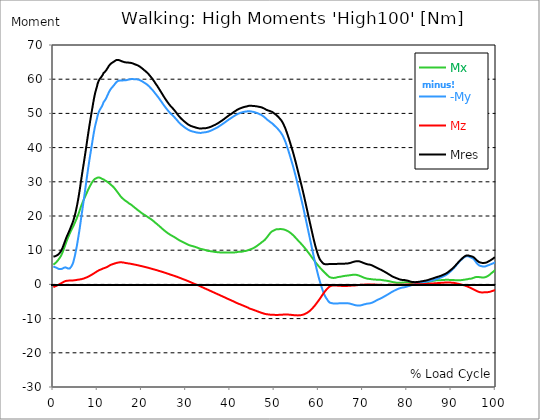
| Category |  Mx |  -My |  Mz |  Mres |
|---|---|---|---|---|
| 0.0 | 5.782 | 5.266 | -0.828 | 8.141 |
| 0.1646090534979424 | 5.938 | 5.157 | -0.719 | 8.172 |
| 0.3292181069958848 | 6.094 | 5.047 | -0.609 | 8.204 |
| 0.5041152263374485 | 6.282 | 4.985 | -0.516 | 8.282 |
| 0.668724279835391 | 6.5 | 4.891 | -0.422 | 8.391 |
| 0.8333333333333333 | 6.735 | 4.766 | -0.313 | 8.501 |
| 0.9979423868312757 | 6.985 | 4.657 | -0.203 | 8.641 |
| 1.162551440329218 | 7.282 | 4.547 | -0.094 | 8.813 |
| 1.337448559670782 | 7.579 | 4.485 | 0.016 | 9.032 |
| 1.5020576131687242 | 7.875 | 4.453 | 0.125 | 9.266 |
| 1.6666666666666665 | 8.251 | 4.469 | 0.266 | 9.61 |
| 1.831275720164609 | 8.672 | 4.547 | 0.391 | 10.016 |
| 1.9958847736625513 | 9.126 | 4.578 | 0.5 | 10.454 |
| 2.170781893004115 | 9.672 | 4.703 | 0.641 | 11.001 |
| 2.3353909465020575 | 10.235 | 4.828 | 0.75 | 11.579 |
| 2.4999999999999996 | 10.829 | 4.938 | 0.859 | 12.173 |
| 2.6646090534979425 | 11.438 | 4.985 | 0.953 | 12.766 |
| 2.829218106995885 | 12.048 | 4.969 | 1.016 | 13.345 |
| 3.0041152263374484 | 12.657 | 4.86 | 1.047 | 13.891 |
| 3.168724279835391 | 13.22 | 4.735 | 1.063 | 14.376 |
| 3.333333333333333 | 13.735 | 4.641 | 1.094 | 14.845 |
| 3.497942386831276 | 14.251 | 4.578 | 1.109 | 15.329 |
| 3.662551440329218 | 14.767 | 4.625 | 1.125 | 15.829 |
| 3.837448559670782 | 15.251 | 4.828 | 1.141 | 16.376 |
| 4.002057613168724 | 15.704 | 5.11 | 1.141 | 16.923 |
| 4.166666666666667 | 16.142 | 5.453 | 1.156 | 17.454 |
| 4.3312757201646095 | 16.564 | 5.875 | 1.156 | 18.001 |
| 4.495884773662552 | 16.985 | 6.438 | 1.156 | 18.595 |
| 4.670781893004115 | 17.47 | 7.313 | 1.188 | 19.345 |
| 4.835390946502058 | 17.939 | 8.188 | 1.219 | 20.079 |
| 4.999999999999999 | 18.439 | 9.219 | 1.25 | 20.97 |
| 5.164609053497943 | 18.954 | 10.298 | 1.281 | 21.939 |
| 5.329218106995885 | 19.454 | 11.423 | 1.328 | 22.955 |
| 5.504115226337448 | 20.001 | 12.688 | 1.359 | 24.095 |
| 5.668724279835391 | 20.548 | 13.985 | 1.391 | 25.298 |
| 5.833333333333333 | 21.173 | 15.36 | 1.422 | 26.611 |
| 5.997942386831276 | 21.798 | 16.767 | 1.453 | 27.986 |
| 6.162551440329218 | 22.47 | 18.329 | 1.484 | 29.517 |
| 6.337448559670782 | 23.064 | 19.845 | 1.531 | 30.939 |
| 6.502057613168724 | 23.626 | 21.345 | 1.578 | 32.346 |
| 6.666666666666666 | 24.158 | 22.845 | 1.641 | 33.752 |
| 6.831275720164609 | 24.673 | 24.345 | 1.719 | 35.112 |
| 6.995884773662552 | 25.158 | 25.83 | 1.781 | 36.487 |
| 7.170781893004115 | 25.642 | 27.424 | 1.875 | 37.893 |
| 7.3353909465020575 | 26.111 | 29.017 | 1.953 | 39.315 |
| 7.500000000000001 | 26.611 | 30.564 | 2.047 | 40.799 |
| 7.664609053497942 | 27.111 | 32.111 | 2.125 | 42.284 |
| 7.829218106995885 | 27.595 | 33.596 | 2.219 | 43.737 |
| 8.004115226337449 | 28.033 | 35.08 | 2.328 | 45.159 |
| 8.168724279835391 | 28.47 | 36.518 | 2.438 | 46.55 |
| 8.333333333333334 | 28.877 | 37.862 | 2.578 | 47.862 |
| 8.497942386831278 | 29.283 | 39.206 | 2.703 | 49.159 |
| 8.662551440329219 | 29.658 | 40.549 | 2.828 | 50.472 |
| 8.837448559670783 | 30.002 | 41.878 | 2.953 | 51.738 |
| 9.002057613168725 | 30.299 | 43.221 | 3.078 | 53.003 |
| 9.166666666666668 | 30.58 | 44.503 | 3.219 | 54.206 |
| 9.33127572016461 | 30.783 | 45.643 | 3.36 | 55.285 |
| 9.495884773662551 | 30.955 | 46.675 | 3.516 | 56.238 |
| 9.670781893004117 | 31.033 | 47.55 | 3.641 | 57.019 |
| 9.83539094650206 | 31.096 | 48.362 | 3.781 | 57.754 |
| 9.999999999999998 | 31.221 | 49.347 | 3.906 | 58.644 |
| 10.16460905349794 | 31.268 | 50.034 | 4.031 | 59.269 |
| 10.329218106995887 | 31.268 | 50.581 | 4.141 | 59.738 |
| 10.504115226337447 | 31.221 | 51.066 | 4.235 | 60.129 |
| 10.66872427983539 | 31.111 | 51.409 | 4.328 | 60.394 |
| 10.833333333333334 | 30.986 | 51.738 | 4.407 | 60.629 |
| 10.997942386831275 | 30.861 | 52.128 | 4.5 | 60.91 |
| 11.162551440329217 | 30.768 | 52.628 | 4.594 | 61.301 |
| 11.337448559670783 | 30.705 | 53.222 | 4.703 | 61.785 |
| 11.502057613168724 | 30.549 | 53.535 | 4.782 | 62.004 |
| 11.666666666666666 | 30.392 | 53.816 | 4.844 | 62.16 |
| 11.831275720164609 | 30.283 | 54.16 | 4.922 | 62.41 |
| 11.995884773662551 | 30.158 | 54.597 | 5.016 | 62.723 |
| 12.170781893004115 | 30.017 | 55.097 | 5.141 | 63.098 |
| 12.335390946502057 | 29.861 | 55.519 | 5.235 | 63.394 |
| 12.5 | 29.721 | 56.035 | 5.375 | 63.785 |
| 12.664609053497943 | 29.533 | 56.457 | 5.5 | 64.066 |
| 12.829218106995885 | 29.361 | 56.847 | 5.625 | 64.348 |
| 13.004115226337449 | 29.142 | 57.175 | 5.719 | 64.551 |
| 13.168724279835391 | 28.971 | 57.441 | 5.813 | 64.707 |
| 13.333333333333332 | 28.783 | 57.691 | 5.891 | 64.848 |
| 13.497942386831276 | 28.58 | 57.925 | 5.953 | 64.988 |
| 13.662551440329217 | 28.361 | 58.175 | 6.032 | 65.113 |
| 13.837448559670783 | 28.111 | 58.457 | 6.094 | 65.27 |
| 14.002057613168724 | 27.83 | 58.769 | 6.172 | 65.426 |
| 14.166666666666666 | 27.564 | 59.05 | 6.235 | 65.567 |
| 14.33127572016461 | 27.267 | 59.238 | 6.297 | 65.629 |
| 14.495884773662551 | 26.986 | 59.394 | 6.36 | 65.645 |
| 14.670781893004115 | 26.689 | 59.519 | 6.391 | 65.645 |
| 14.835390946502057 | 26.408 | 59.566 | 6.422 | 65.582 |
| 15.000000000000002 | 26.111 | 59.597 | 6.454 | 65.488 |
| 15.164609053497943 | 25.798 | 59.629 | 6.469 | 65.41 |
| 15.329218106995883 | 25.548 | 59.629 | 6.469 | 65.301 |
| 15.504115226337449 | 25.314 | 59.644 | 6.454 | 65.223 |
| 15.66872427983539 | 25.111 | 59.644 | 6.422 | 65.145 |
| 15.833333333333334 | 24.939 | 59.66 | 6.391 | 65.082 |
| 15.997942386831276 | 24.752 | 59.676 | 6.36 | 65.035 |
| 16.162551440329217 | 24.58 | 59.676 | 6.313 | 64.957 |
| 16.337448559670783 | 24.439 | 59.691 | 6.266 | 64.926 |
| 16.502057613168724 | 24.283 | 59.722 | 6.235 | 64.895 |
| 16.666666666666668 | 24.126 | 59.769 | 6.188 | 64.879 |
| 16.83127572016461 | 23.97 | 59.832 | 6.157 | 64.863 |
| 16.995884773662556 | 23.798 | 59.894 | 6.125 | 64.848 |
| 17.170781893004115 | 23.626 | 59.941 | 6.094 | 64.832 |
| 17.33539094650206 | 23.501 | 59.972 | 6.063 | 64.801 |
| 17.500000000000004 | 23.376 | 60.004 | 6.016 | 64.77 |
| 17.66460905349794 | 23.22 | 60.035 | 5.985 | 64.738 |
| 17.82921810699589 | 23.048 | 60.051 | 5.938 | 64.676 |
| 18.00411522633745 | 22.876 | 60.035 | 5.891 | 64.598 |
| 18.16872427983539 | 22.689 | 60.019 | 5.844 | 64.504 |
| 18.333333333333336 | 22.517 | 59.988 | 5.797 | 64.41 |
| 18.497942386831276 | 22.329 | 59.972 | 5.75 | 64.316 |
| 18.66255144032922 | 22.158 | 59.972 | 5.719 | 64.238 |
| 18.837448559670786 | 22.001 | 59.957 | 5.672 | 64.176 |
| 19.002057613168724 | 21.829 | 59.941 | 5.625 | 64.098 |
| 19.166666666666668 | 21.642 | 59.894 | 5.578 | 63.973 |
| 19.331275720164612 | 21.486 | 59.832 | 5.532 | 63.848 |
| 19.495884773662553 | 21.329 | 59.754 | 5.485 | 63.723 |
| 19.67078189300412 | 21.158 | 59.66 | 5.422 | 63.566 |
| 19.83539094650206 | 20.986 | 59.551 | 5.375 | 63.41 |
| 19.999999999999996 | 20.829 | 59.426 | 5.328 | 63.238 |
| 20.164609053497944 | 20.689 | 59.3 | 5.266 | 63.066 |
| 20.32921810699588 | 20.533 | 59.175 | 5.219 | 62.894 |
| 20.504115226337447 | 20.407 | 59.019 | 5.157 | 62.691 |
| 20.66872427983539 | 20.267 | 58.879 | 5.11 | 62.519 |
| 20.833333333333332 | 20.142 | 58.738 | 5.063 | 62.348 |
| 20.997942386831276 | 20.001 | 58.613 | 5.016 | 62.176 |
| 21.162551440329217 | 19.861 | 58.441 | 4.953 | 61.957 |
| 21.33744855967078 | 19.72 | 58.269 | 4.891 | 61.738 |
| 21.502057613168724 | 19.564 | 58.082 | 4.844 | 61.519 |
| 21.666666666666668 | 19.423 | 57.879 | 4.782 | 61.269 |
| 21.83127572016461 | 19.282 | 57.644 | 4.719 | 61.004 |
| 21.99588477366255 | 19.142 | 57.41 | 4.657 | 60.738 |
| 22.170781893004115 | 18.986 | 57.191 | 4.594 | 60.472 |
| 22.335390946502056 | 18.829 | 56.957 | 4.532 | 60.191 |
| 22.5 | 18.657 | 56.722 | 4.469 | 59.91 |
| 22.664609053497944 | 18.47 | 56.457 | 4.407 | 59.597 |
| 22.82921810699588 | 18.282 | 56.191 | 4.36 | 59.285 |
| 23.004115226337447 | 18.095 | 55.894 | 4.297 | 58.957 |
| 23.16872427983539 | 17.907 | 55.628 | 4.235 | 58.629 |
| 23.333333333333332 | 17.72 | 55.347 | 4.172 | 58.3 |
| 23.497942386831276 | 17.564 | 55.081 | 4.094 | 58.004 |
| 23.662551440329217 | 17.376 | 54.8 | 4.031 | 57.66 |
| 23.83744855967078 | 17.189 | 54.503 | 3.969 | 57.332 |
| 24.002057613168727 | 17.001 | 54.206 | 3.906 | 56.972 |
| 24.166666666666664 | 16.814 | 53.894 | 3.844 | 56.628 |
| 24.33127572016461 | 16.61 | 53.597 | 3.781 | 56.269 |
| 24.495884773662553 | 16.423 | 53.285 | 3.719 | 55.925 |
| 24.670781893004115 | 16.235 | 52.972 | 3.641 | 55.566 |
| 24.83539094650206 | 16.048 | 52.659 | 3.578 | 55.206 |
| 25.0 | 15.86 | 52.363 | 3.516 | 54.863 |
| 25.164609053497944 | 15.688 | 52.081 | 3.438 | 54.535 |
| 25.329218106995885 | 15.517 | 51.784 | 3.375 | 54.206 |
| 25.504115226337447 | 15.345 | 51.503 | 3.297 | 53.878 |
| 25.66872427983539 | 15.173 | 51.222 | 3.219 | 53.566 |
| 25.833333333333332 | 15.017 | 50.956 | 3.141 | 53.269 |
| 25.997942386831276 | 14.86 | 50.706 | 3.078 | 52.972 |
| 26.16255144032922 | 14.72 | 50.441 | 3 | 52.675 |
| 26.337448559670783 | 14.579 | 50.191 | 2.922 | 52.394 |
| 26.502057613168724 | 14.454 | 49.987 | 2.86 | 52.159 |
| 26.666666666666664 | 14.329 | 49.784 | 2.781 | 51.925 |
| 26.83127572016461 | 14.22 | 49.581 | 2.719 | 51.706 |
| 26.995884773662553 | 14.095 | 49.394 | 2.641 | 51.488 |
| 27.170781893004115 | 13.97 | 49.159 | 2.563 | 51.222 |
| 27.33539094650206 | 13.845 | 48.925 | 2.5 | 50.956 |
| 27.499999999999996 | 13.72 | 48.706 | 2.422 | 50.706 |
| 27.66460905349794 | 13.579 | 48.456 | 2.344 | 50.425 |
| 27.829218106995885 | 13.438 | 48.206 | 2.281 | 50.144 |
| 28.004115226337447 | 13.298 | 47.956 | 2.203 | 49.862 |
| 28.16872427983539 | 13.157 | 47.69 | 2.11 | 49.566 |
| 28.333333333333332 | 13.016 | 47.44 | 2.031 | 49.284 |
| 28.49794238683128 | 12.891 | 47.222 | 1.953 | 49.034 |
| 28.66255144032922 | 12.782 | 47.003 | 1.875 | 48.8 |
| 28.837448559670783 | 12.673 | 46.8 | 1.781 | 48.581 |
| 29.002057613168724 | 12.563 | 46.612 | 1.703 | 48.362 |
| 29.166666666666664 | 12.47 | 46.425 | 1.625 | 48.159 |
| 29.331275720164612 | 12.36 | 46.268 | 1.531 | 47.956 |
| 29.495884773662553 | 12.251 | 46.097 | 1.453 | 47.769 |
| 29.670781893004115 | 12.141 | 45.94 | 1.375 | 47.581 |
| 29.835390946502056 | 12.032 | 45.784 | 1.297 | 47.409 |
| 30.000000000000004 | 11.923 | 45.628 | 1.203 | 47.237 |
| 30.164609053497944 | 11.798 | 45.487 | 1.125 | 47.065 |
| 30.329218106995885 | 11.688 | 45.347 | 1.031 | 46.893 |
| 30.504115226337447 | 11.579 | 45.222 | 0.953 | 46.737 |
| 30.66872427983539 | 11.501 | 45.112 | 0.859 | 46.612 |
| 30.833333333333336 | 11.423 | 45.003 | 0.75 | 46.503 |
| 30.99794238683128 | 11.36 | 44.909 | 0.656 | 46.393 |
| 31.162551440329217 | 11.298 | 44.831 | 0.563 | 46.3 |
| 31.33744855967078 | 11.235 | 44.753 | 0.469 | 46.206 |
| 31.50205761316873 | 11.188 | 44.706 | 0.375 | 46.143 |
| 31.666666666666668 | 11.126 | 44.659 | 0.281 | 46.081 |
| 31.831275720164612 | 11.063 | 44.612 | 0.203 | 46.018 |
| 31.995884773662553 | 11.001 | 44.55 | 0.109 | 45.94 |
| 32.17078189300411 | 10.923 | 44.503 | 0.031 | 45.878 |
| 32.33539094650206 | 10.844 | 44.44 | -0.031 | 45.8 |
| 32.5 | 10.766 | 44.393 | -0.125 | 45.737 |
| 32.66460905349794 | 10.673 | 44.362 | -0.219 | 45.69 |
| 32.82921810699589 | 10.594 | 44.331 | -0.313 | 45.643 |
| 33.00411522633745 | 10.501 | 44.315 | -0.406 | 45.612 |
| 33.168724279835395 | 10.423 | 44.3 | -0.516 | 45.565 |
| 33.333333333333336 | 10.376 | 44.284 | -0.625 | 45.565 |
| 33.49794238683128 | 10.313 | 44.315 | -0.719 | 45.581 |
| 33.66255144032922 | 10.282 | 44.378 | -0.828 | 45.628 |
| 33.83744855967078 | 10.235 | 44.425 | -0.922 | 45.659 |
| 34.00205761316873 | 10.172 | 44.44 | -1.016 | 45.675 |
| 34.16666666666667 | 10.126 | 44.456 | -1.125 | 45.675 |
| 34.331275720164605 | 10.047 | 44.471 | -1.219 | 45.69 |
| 34.49588477366255 | 9.985 | 44.503 | -1.313 | 45.69 |
| 34.67078189300412 | 9.891 | 44.565 | -1.406 | 45.737 |
| 34.83539094650206 | 9.829 | 44.612 | -1.484 | 45.784 |
| 35.00000000000001 | 9.782 | 44.659 | -1.594 | 45.815 |
| 35.16460905349794 | 9.751 | 44.737 | -1.688 | 45.893 |
| 35.32921810699588 | 9.735 | 44.815 | -1.797 | 45.972 |
| 35.504115226337454 | 9.719 | 44.909 | -1.891 | 46.05 |
| 35.668724279835395 | 9.672 | 44.987 | -1.984 | 46.143 |
| 35.833333333333336 | 9.641 | 45.081 | -2.078 | 46.222 |
| 35.99794238683128 | 9.61 | 45.19 | -2.188 | 46.331 |
| 36.16255144032922 | 9.579 | 45.3 | -2.297 | 46.425 |
| 36.33744855967078 | 9.547 | 45.393 | -2.391 | 46.518 |
| 36.50205761316873 | 9.501 | 45.503 | -2.485 | 46.628 |
| 36.66666666666667 | 9.469 | 45.612 | -2.578 | 46.737 |
| 36.831275720164605 | 9.454 | 45.722 | -2.672 | 46.847 |
| 36.99588477366255 | 9.422 | 45.831 | -2.781 | 46.956 |
| 37.17078189300412 | 9.407 | 45.972 | -2.875 | 47.081 |
| 37.33539094650206 | 9.391 | 46.097 | -2.969 | 47.222 |
| 37.5 | 9.376 | 46.237 | -3.078 | 47.362 |
| 37.66460905349794 | 9.344 | 46.378 | -3.172 | 47.503 |
| 37.82921810699589 | 9.329 | 46.534 | -3.266 | 47.659 |
| 38.00411522633745 | 9.313 | 46.675 | -3.36 | 47.8 |
| 38.168724279835395 | 9.329 | 46.815 | -3.469 | 47.94 |
| 38.333333333333336 | 9.329 | 46.956 | -3.563 | 48.097 |
| 38.49794238683127 | 9.329 | 47.112 | -3.656 | 48.253 |
| 38.662551440329224 | 9.329 | 47.269 | -3.75 | 48.409 |
| 38.83744855967078 | 9.329 | 47.425 | -3.86 | 48.581 |
| 39.00205761316872 | 9.329 | 47.581 | -3.953 | 48.753 |
| 39.16666666666667 | 9.344 | 47.737 | -4.047 | 48.909 |
| 39.331275720164605 | 9.344 | 47.894 | -4.157 | 49.081 |
| 39.49588477366255 | 9.344 | 48.05 | -4.266 | 49.237 |
| 39.67078189300412 | 9.344 | 48.206 | -4.36 | 49.409 |
| 39.83539094650206 | 9.344 | 48.347 | -4.469 | 49.55 |
| 39.99999999999999 | 9.313 | 48.472 | -4.547 | 49.675 |
| 40.16460905349794 | 9.297 | 48.612 | -4.641 | 49.8 |
| 40.32921810699589 | 9.297 | 48.753 | -4.735 | 49.956 |
| 40.50411522633745 | 9.313 | 48.909 | -4.828 | 50.112 |
| 40.668724279835395 | 9.313 | 49.065 | -4.922 | 50.284 |
| 40.83333333333333 | 9.329 | 49.206 | -5.032 | 50.441 |
| 40.99794238683128 | 9.36 | 49.331 | -5.125 | 50.566 |
| 41.16255144032922 | 9.376 | 49.456 | -5.235 | 50.706 |
| 41.33744855967078 | 9.407 | 49.581 | -5.344 | 50.847 |
| 41.50205761316872 | 9.438 | 49.722 | -5.453 | 51.003 |
| 41.666666666666664 | 9.469 | 49.831 | -5.547 | 51.144 |
| 41.83127572016461 | 9.516 | 49.925 | -5.625 | 51.238 |
| 41.99588477366255 | 9.547 | 50.003 | -5.719 | 51.331 |
| 42.17078189300412 | 9.532 | 50.097 | -5.797 | 51.441 |
| 42.33539094650206 | 9.532 | 50.191 | -5.875 | 51.519 |
| 42.5 | 9.547 | 50.237 | -5.969 | 51.597 |
| 42.66460905349794 | 9.563 | 50.3 | -6.063 | 51.659 |
| 42.82921810699589 | 9.61 | 50.394 | -6.141 | 51.753 |
| 43.00411522633745 | 9.672 | 50.425 | -6.235 | 51.831 |
| 43.16872427983539 | 9.735 | 50.472 | -6.329 | 51.878 |
| 43.333333333333336 | 9.766 | 50.503 | -6.422 | 51.941 |
| 43.49794238683128 | 9.797 | 50.534 | -6.5 | 51.988 |
| 43.66255144032922 | 9.844 | 50.566 | -6.594 | 52.034 |
| 43.83744855967078 | 9.907 | 50.597 | -6.688 | 52.081 |
| 44.00205761316873 | 9.985 | 50.628 | -6.797 | 52.144 |
| 44.166666666666664 | 10.063 | 50.659 | -6.922 | 52.206 |
| 44.33127572016461 | 10.141 | 50.659 | -7.032 | 52.238 |
| 44.49588477366255 | 10.219 | 50.612 | -7.11 | 52.222 |
| 44.67078189300411 | 10.298 | 50.566 | -7.188 | 52.206 |
| 44.835390946502066 | 10.391 | 50.55 | -7.25 | 52.206 |
| 45.0 | 10.469 | 50.503 | -7.329 | 52.191 |
| 45.16460905349794 | 10.563 | 50.456 | -7.407 | 52.191 |
| 45.32921810699589 | 10.673 | 50.409 | -7.485 | 52.175 |
| 45.504115226337454 | 10.798 | 50.347 | -7.563 | 52.144 |
| 45.668724279835395 | 10.938 | 50.269 | -7.641 | 52.113 |
| 45.83333333333333 | 11.079 | 50.206 | -7.735 | 52.081 |
| 45.99794238683128 | 11.219 | 50.128 | -7.813 | 52.05 |
| 46.16255144032922 | 11.376 | 50.034 | -7.891 | 52.019 |
| 46.33744855967078 | 11.532 | 49.956 | -7.969 | 51.972 |
| 46.50205761316873 | 11.704 | 49.847 | -8.047 | 51.925 |
| 46.666666666666664 | 11.876 | 49.753 | -8.125 | 51.894 |
| 46.831275720164605 | 12.016 | 49.675 | -8.204 | 51.847 |
| 46.99588477366255 | 12.188 | 49.566 | -8.282 | 51.8 |
| 47.17078189300412 | 12.391 | 49.425 | -8.344 | 51.722 |
| 47.33539094650206 | 12.532 | 49.284 | -8.422 | 51.628 |
| 47.5 | 12.673 | 49.144 | -8.485 | 51.534 |
| 47.66460905349794 | 12.86 | 48.972 | -8.563 | 51.425 |
| 47.82921810699588 | 13.063 | 48.784 | -8.626 | 51.316 |
| 48.004115226337454 | 13.298 | 48.597 | -8.672 | 51.191 |
| 48.168724279835395 | 13.563 | 48.378 | -8.704 | 51.05 |
| 48.33333333333333 | 13.845 | 48.175 | -8.735 | 50.941 |
| 48.49794238683128 | 14.126 | 48.019 | -8.766 | 50.878 |
| 48.66255144032922 | 14.423 | 47.862 | -8.797 | 50.816 |
| 48.83744855967078 | 14.704 | 47.69 | -8.829 | 50.737 |
| 49.00205761316873 | 14.954 | 47.519 | -8.844 | 50.659 |
| 49.166666666666664 | 15.204 | 47.362 | -8.86 | 50.581 |
| 49.331275720164605 | 15.407 | 47.222 | -8.876 | 50.519 |
| 49.49588477366255 | 15.563 | 47.05 | -8.891 | 50.409 |
| 49.67078189300412 | 15.673 | 46.862 | -8.907 | 50.269 |
| 49.83539094650206 | 15.751 | 46.659 | -8.907 | 50.097 |
| 50.0 | 15.86 | 46.425 | -8.907 | 49.925 |
| 50.16460905349794 | 15.985 | 46.222 | -8.922 | 49.784 |
| 50.32921810699589 | 16.079 | 46.018 | -8.938 | 49.628 |
| 50.504115226337454 | 16.126 | 45.8 | -8.938 | 49.425 |
| 50.668724279835395 | 16.142 | 45.581 | -8.922 | 49.222 |
| 50.83333333333333 | 16.157 | 45.347 | -8.922 | 49.019 |
| 50.99794238683128 | 16.157 | 45.097 | -8.907 | 48.784 |
| 51.162551440329224 | 16.173 | 44.815 | -8.907 | 48.534 |
| 51.33744855967078 | 16.173 | 44.55 | -8.891 | 48.284 |
| 51.50205761316873 | 16.157 | 44.268 | -8.876 | 48.019 |
| 51.666666666666664 | 16.157 | 43.925 | -8.86 | 47.706 |
| 51.83127572016461 | 16.142 | 43.534 | -8.844 | 47.331 |
| 51.99588477366255 | 16.095 | 43.096 | -8.829 | 46.909 |
| 52.17078189300412 | 16.048 | 42.628 | -8.829 | 46.456 |
| 52.335390946502066 | 15.97 | 42.128 | -8.813 | 45.987 |
| 52.5 | 15.892 | 41.581 | -8.813 | 45.44 |
| 52.66460905349795 | 15.798 | 40.956 | -8.813 | 44.846 |
| 52.82921810699588 | 15.688 | 40.315 | -8.829 | 44.237 |
| 53.00411522633745 | 15.595 | 39.659 | -8.829 | 43.596 |
| 53.1687242798354 | 15.47 | 38.987 | -8.844 | 42.956 |
| 53.33333333333333 | 15.329 | 38.299 | -8.844 | 42.284 |
| 53.49794238683128 | 15.173 | 37.58 | -8.876 | 41.581 |
| 53.66255144032922 | 15.001 | 36.862 | -8.891 | 40.877 |
| 53.83744855967078 | 14.813 | 36.127 | -8.922 | 40.159 |
| 54.00205761316873 | 14.642 | 35.424 | -8.938 | 39.456 |
| 54.166666666666664 | 14.438 | 34.674 | -8.969 | 38.721 |
| 54.33127572016461 | 14.235 | 33.908 | -8.985 | 37.971 |
| 54.495884773662546 | 14.001 | 33.096 | -9.001 | 37.174 |
| 54.67078189300412 | 13.782 | 32.268 | -9.032 | 36.346 |
| 54.835390946502066 | 13.548 | 31.424 | -9.047 | 35.533 |
| 54.99999999999999 | 13.313 | 30.564 | -9.047 | 34.674 |
| 55.16460905349795 | 13.079 | 29.674 | -9.063 | 33.815 |
| 55.32921810699588 | 12.829 | 28.799 | -9.063 | 32.94 |
| 55.50411522633745 | 12.595 | 27.908 | -9.047 | 32.08 |
| 55.668724279835395 | 12.36 | 27.017 | -9.032 | 31.221 |
| 55.83333333333333 | 12.126 | 26.127 | -9.001 | 30.346 |
| 55.99794238683128 | 11.923 | 25.252 | -8.985 | 29.502 |
| 56.162551440329224 | 11.688 | 24.33 | -8.938 | 28.627 |
| 56.33744855967078 | 11.438 | 23.392 | -8.891 | 27.72 |
| 56.50205761316873 | 11.188 | 22.454 | -8.829 | 26.799 |
| 56.666666666666664 | 10.938 | 21.501 | -8.766 | 25.877 |
| 56.83127572016461 | 10.673 | 20.517 | -8.672 | 24.923 |
| 56.99588477366256 | 10.407 | 19.501 | -8.563 | 23.939 |
| 57.17078189300412 | 10.126 | 18.486 | -8.454 | 22.955 |
| 57.335390946502066 | 9.844 | 17.485 | -8.329 | 21.986 |
| 57.49999999999999 | 9.563 | 16.47 | -8.204 | 21.001 |
| 57.66460905349794 | 9.282 | 15.454 | -8.063 | 20.017 |
| 57.829218106995896 | 9.001 | 14.454 | -7.907 | 19.048 |
| 58.00411522633745 | 8.719 | 13.438 | -7.719 | 18.095 |
| 58.168724279835395 | 8.422 | 12.438 | -7.516 | 17.142 |
| 58.33333333333333 | 8.125 | 11.423 | -7.313 | 16.173 |
| 58.49794238683128 | 7.844 | 10.407 | -7.079 | 15.22 |
| 58.662551440329224 | 7.547 | 9.407 | -6.86 | 14.266 |
| 58.83744855967078 | 7.25 | 8.407 | -6.625 | 13.329 |
| 59.00205761316873 | 6.969 | 7.407 | -6.375 | 12.438 |
| 59.16666666666666 | 6.672 | 6.438 | -6.094 | 11.579 |
| 59.33127572016461 | 6.375 | 5.516 | -5.828 | 10.782 |
| 59.49588477366256 | 6.094 | 4.625 | -5.532 | 10.047 |
| 59.67078189300411 | 5.828 | 3.75 | -5.25 | 9.344 |
| 59.835390946502066 | 5.563 | 2.891 | -4.953 | 8.688 |
| 60.00000000000001 | 5.313 | 2.047 | -4.657 | 8.079 |
| 60.16460905349794 | 5.063 | 1.266 | -4.36 | 7.547 |
| 60.32921810699589 | 4.828 | 0.547 | -4.047 | 7.188 |
| 60.50411522633745 | 4.594 | -0.156 | -3.719 | 6.875 |
| 60.66872427983539 | 4.36 | -0.828 | -3.406 | 6.61 |
| 60.833333333333336 | 4.125 | -1.484 | -3.078 | 6.36 |
| 60.99794238683128 | 3.906 | -2.11 | -2.766 | 6.141 |
| 61.162551440329224 | 3.688 | -2.688 | -2.469 | 5.985 |
| 61.33744855967078 | 3.469 | -3.188 | -2.172 | 5.907 |
| 61.50205761316872 | 3.25 | -3.594 | -1.891 | 5.891 |
| 61.66666666666667 | 3.047 | -3.953 | -1.641 | 5.907 |
| 61.831275720164605 | 2.828 | -4.266 | -1.406 | 5.922 |
| 61.99588477366256 | 2.625 | -4.594 | -1.172 | 5.922 |
| 62.17078189300411 | 2.406 | -4.907 | -0.953 | 5.922 |
| 62.33539094650205 | 2.235 | -5.141 | -0.75 | 5.922 |
| 62.50000000000001 | 2.094 | -5.328 | -0.578 | 5.953 |
| 62.66460905349794 | 2.031 | -5.375 | -0.484 | 5.938 |
| 62.82921810699589 | 1.969 | -5.453 | -0.422 | 5.953 |
| 63.00411522633746 | 1.922 | -5.516 | -0.359 | 5.969 |
| 63.16872427983539 | 1.891 | -5.547 | -0.328 | 5.969 |
| 63.333333333333336 | 1.891 | -5.578 | -0.313 | 5.969 |
| 63.49794238683128 | 1.906 | -5.563 | -0.313 | 5.953 |
| 63.662551440329224 | 1.922 | -5.563 | -0.297 | 5.953 |
| 63.83744855967079 | 1.953 | -5.563 | -0.297 | 5.969 |
| 64.00205761316873 | 2.016 | -5.563 | -0.328 | 5.985 |
| 64.16666666666667 | 2.078 | -5.563 | -0.344 | 6 |
| 64.3312757201646 | 2.141 | -5.563 | -0.375 | 6.016 |
| 64.49588477366255 | 2.172 | -5.547 | -0.391 | 6.016 |
| 64.67078189300412 | 2.203 | -5.532 | -0.391 | 6.016 |
| 64.83539094650206 | 2.219 | -5.532 | -0.406 | 6.016 |
| 65.0 | 2.266 | -5.532 | -0.422 | 6.016 |
| 65.16460905349794 | 2.313 | -5.532 | -0.438 | 6.032 |
| 65.32921810699588 | 2.36 | -5.516 | -0.453 | 6.047 |
| 65.50411522633745 | 2.406 | -5.516 | -0.453 | 6.047 |
| 65.66872427983539 | 2.438 | -5.516 | -0.453 | 6.063 |
| 65.83333333333334 | 2.469 | -5.5 | -0.453 | 6.063 |
| 65.99794238683127 | 2.516 | -5.5 | -0.453 | 6.078 |
| 66.16255144032922 | 2.531 | -5.5 | -0.453 | 6.094 |
| 66.33744855967079 | 2.563 | -5.516 | -0.453 | 6.11 |
| 66.50205761316873 | 2.578 | -5.516 | -0.438 | 6.11 |
| 66.66666666666667 | 2.61 | -5.532 | -0.422 | 6.141 |
| 66.8312757201646 | 2.656 | -5.563 | -0.422 | 6.188 |
| 66.99588477366255 | 2.672 | -5.61 | -0.391 | 6.235 |
| 67.17078189300412 | 2.703 | -5.657 | -0.375 | 6.297 |
| 67.33539094650206 | 2.735 | -5.719 | -0.359 | 6.36 |
| 67.5 | 2.766 | -5.782 | -0.344 | 6.438 |
| 67.66460905349794 | 2.797 | -5.844 | -0.344 | 6.5 |
| 67.8292181069959 | 2.828 | -5.907 | -0.328 | 6.579 |
| 68.00411522633746 | 2.844 | -5.969 | -0.313 | 6.641 |
| 68.16872427983539 | 2.844 | -6.047 | -0.297 | 6.704 |
| 68.33333333333334 | 2.828 | -6.078 | -0.281 | 6.735 |
| 68.49794238683127 | 2.797 | -6.125 | -0.25 | 6.766 |
| 68.66255144032921 | 2.75 | -6.188 | -0.234 | 6.797 |
| 68.83744855967078 | 2.703 | -6.204 | -0.219 | 6.797 |
| 69.00205761316872 | 2.625 | -6.219 | -0.188 | 6.782 |
| 69.16666666666667 | 2.547 | -6.204 | -0.172 | 6.75 |
| 69.33127572016461 | 2.469 | -6.172 | -0.141 | 6.672 |
| 69.49588477366255 | 2.375 | -6.125 | -0.125 | 6.594 |
| 69.67078189300412 | 2.281 | -6.078 | -0.109 | 6.516 |
| 69.83539094650206 | 2.188 | -6.016 | -0.109 | 6.438 |
| 70.00000000000001 | 2.094 | -5.938 | -0.094 | 6.329 |
| 70.16460905349794 | 2.016 | -5.875 | -0.078 | 6.25 |
| 70.32921810699588 | 1.922 | -5.844 | -0.063 | 6.172 |
| 70.50411522633745 | 1.859 | -5.782 | -0.047 | 6.094 |
| 70.66872427983539 | 1.781 | -5.719 | -0.031 | 6.016 |
| 70.83333333333333 | 1.719 | -5.657 | -0.031 | 5.938 |
| 70.99794238683128 | 1.672 | -5.625 | -0.016 | 5.891 |
| 71.16255144032922 | 1.641 | -5.594 | -0.016 | 5.844 |
| 71.33744855967079 | 1.609 | -5.578 | 0 | 5.813 |
| 71.50205761316873 | 1.578 | -5.547 | 0 | 5.782 |
| 71.66666666666667 | 1.563 | -5.485 | -0.016 | 5.719 |
| 71.83127572016461 | 1.531 | -5.438 | -0.016 | 5.672 |
| 71.99588477366255 | 1.5 | -5.375 | -0.031 | 5.594 |
| 72.17078189300412 | 1.469 | -5.282 | -0.031 | 5.5 |
| 72.33539094650205 | 1.453 | -5.172 | -0.047 | 5.391 |
| 72.5 | 1.438 | -5.063 | -0.063 | 5.282 |
| 72.66460905349795 | 1.422 | -4.969 | -0.063 | 5.172 |
| 72.82921810699588 | 1.406 | -4.844 | -0.078 | 5.063 |
| 73.00411522633746 | 1.391 | -4.719 | -0.094 | 4.938 |
| 73.1687242798354 | 1.375 | -4.61 | -0.094 | 4.828 |
| 73.33333333333334 | 1.375 | -4.5 | -0.109 | 4.719 |
| 73.49794238683127 | 1.375 | -4.391 | -0.109 | 4.61 |
| 73.66255144032921 | 1.359 | -4.297 | -0.125 | 4.516 |
| 73.83744855967078 | 1.344 | -4.203 | -0.125 | 4.422 |
| 74.00205761316873 | 1.328 | -4.094 | -0.125 | 4.328 |
| 74.16666666666667 | 1.297 | -3.985 | -0.125 | 4.219 |
| 74.33127572016461 | 1.266 | -3.875 | -0.141 | 4.094 |
| 74.49588477366255 | 1.219 | -3.766 | -0.141 | 3.985 |
| 74.67078189300412 | 1.188 | -3.641 | -0.141 | 3.86 |
| 74.83539094650207 | 1.156 | -3.516 | -0.141 | 3.735 |
| 75.0 | 1.125 | -3.391 | -0.141 | 3.61 |
| 75.16460905349794 | 1.109 | -3.281 | -0.141 | 3.5 |
| 75.32921810699588 | 1.078 | -3.156 | -0.141 | 3.375 |
| 75.50411522633745 | 1.047 | -3.031 | -0.141 | 3.25 |
| 75.6687242798354 | 1 | -2.891 | -0.141 | 3.11 |
| 75.83333333333333 | 0.953 | -2.766 | -0.141 | 2.969 |
| 75.99794238683128 | 0.906 | -2.641 | -0.125 | 2.844 |
| 76.16255144032922 | 0.859 | -2.516 | -0.125 | 2.719 |
| 76.33744855967079 | 0.813 | -2.375 | -0.125 | 2.578 |
| 76.50205761316873 | 0.75 | -2.235 | -0.109 | 2.438 |
| 76.66666666666667 | 0.703 | -2.11 | -0.109 | 2.313 |
| 76.83127572016461 | 0.656 | -2 | -0.109 | 2.203 |
| 76.99588477366254 | 0.625 | -1.891 | -0.094 | 2.11 |
| 77.17078189300412 | 0.578 | -1.781 | -0.094 | 2.031 |
| 77.33539094650206 | 0.547 | -1.672 | -0.094 | 1.938 |
| 77.5 | 0.516 | -1.578 | -0.078 | 1.859 |
| 77.66460905349794 | 0.484 | -1.484 | -0.078 | 1.781 |
| 77.82921810699588 | 0.453 | -1.375 | -0.078 | 1.688 |
| 78.00411522633745 | 0.453 | -1.281 | -0.094 | 1.594 |
| 78.1687242798354 | 0.453 | -1.203 | -0.094 | 1.516 |
| 78.33333333333334 | 0.453 | -1.125 | -0.094 | 1.453 |
| 78.49794238683127 | 0.469 | -1.063 | -0.094 | 1.391 |
| 78.66255144032921 | 0.5 | -1 | -0.094 | 1.344 |
| 78.83744855967078 | 0.531 | -0.953 | -0.078 | 1.313 |
| 79.00205761316873 | 0.563 | -0.906 | -0.078 | 1.297 |
| 79.16666666666667 | 0.578 | -0.875 | -0.078 | 1.281 |
| 79.33127572016461 | 0.594 | -0.844 | -0.078 | 1.266 |
| 79.49588477366257 | 0.594 | -0.797 | -0.063 | 1.25 |
| 79.67078189300412 | 0.609 | -0.75 | -0.063 | 1.219 |
| 79.83539094650207 | 0.609 | -0.688 | -0.063 | 1.156 |
| 79.99999999999999 | 0.609 | -0.609 | -0.047 | 1.109 |
| 80.16460905349794 | 0.594 | -0.547 | -0.047 | 1.063 |
| 80.32921810699588 | 0.563 | -0.484 | -0.047 | 0.984 |
| 80.50411522633745 | 0.516 | -0.422 | -0.031 | 0.922 |
| 80.66872427983539 | 0.469 | -0.344 | -0.031 | 0.844 |
| 80.83333333333333 | 0.422 | -0.281 | -0.016 | 0.781 |
| 80.99794238683128 | 0.375 | -0.219 | -0.016 | 0.734 |
| 81.16255144032922 | 0.328 | -0.141 | -0.016 | 0.703 |
| 81.33744855967079 | 0.281 | -0.063 | 0 | 0.688 |
| 81.50205761316873 | 0.234 | 0.016 | 0 | 0.672 |
| 81.66666666666666 | 0.172 | 0.078 | 0 | 0.672 |
| 81.83127572016461 | 0.141 | 0.141 | 0 | 0.656 |
| 81.99588477366255 | 0.094 | 0.203 | 0.016 | 0.688 |
| 82.1707818930041 | 0.078 | 0.25 | 0.016 | 0.703 |
| 82.33539094650206 | 0.078 | 0.281 | 0.016 | 0.719 |
| 82.5 | 0.094 | 0.328 | 0.016 | 0.734 |
| 82.66460905349794 | 0.094 | 0.391 | 0.016 | 0.75 |
| 82.8292181069959 | 0.109 | 0.438 | 0.031 | 0.797 |
| 83.00411522633745 | 0.141 | 0.484 | 0.047 | 0.828 |
| 83.1687242798354 | 0.172 | 0.531 | 0.047 | 0.875 |
| 83.33333333333333 | 0.203 | 0.578 | 0.063 | 0.922 |
| 83.49794238683127 | 0.234 | 0.625 | 0.078 | 0.953 |
| 83.66255144032922 | 0.281 | 0.672 | 0.078 | 0.984 |
| 83.83744855967078 | 0.328 | 0.703 | 0.094 | 1.031 |
| 84.00205761316873 | 0.391 | 0.734 | 0.109 | 1.063 |
| 84.16666666666667 | 0.438 | 0.766 | 0.125 | 1.094 |
| 84.33127572016461 | 0.5 | 0.781 | 0.125 | 1.141 |
| 84.49588477366257 | 0.563 | 0.828 | 0.156 | 1.203 |
| 84.67078189300412 | 0.641 | 0.859 | 0.172 | 1.25 |
| 84.83539094650206 | 0.719 | 0.906 | 0.188 | 1.344 |
| 85.0 | 0.781 | 0.938 | 0.203 | 1.406 |
| 85.16460905349794 | 0.844 | 0.984 | 0.219 | 1.484 |
| 85.32921810699588 | 0.906 | 1.031 | 0.234 | 1.547 |
| 85.50411522633745 | 0.953 | 1.094 | 0.25 | 1.625 |
| 85.66872427983539 | 0.984 | 1.156 | 0.266 | 1.688 |
| 85.83333333333334 | 1.031 | 1.219 | 0.281 | 1.75 |
| 85.99794238683128 | 1.078 | 1.281 | 0.297 | 1.828 |
| 86.16255144032922 | 1.109 | 1.359 | 0.313 | 1.906 |
| 86.33744855967078 | 1.141 | 1.438 | 0.313 | 1.984 |
| 86.50205761316873 | 1.172 | 1.5 | 0.328 | 2.063 |
| 86.66666666666667 | 1.203 | 1.563 | 0.359 | 2.125 |
| 86.8312757201646 | 1.234 | 1.625 | 0.375 | 2.188 |
| 86.99588477366255 | 1.234 | 1.703 | 0.391 | 2.266 |
| 87.17078189300412 | 1.219 | 1.781 | 0.406 | 2.328 |
| 87.33539094650206 | 1.234 | 1.875 | 0.422 | 2.391 |
| 87.5 | 1.25 | 1.969 | 0.438 | 2.453 |
| 87.66460905349794 | 1.25 | 2.063 | 0.453 | 2.531 |
| 87.8292181069959 | 1.266 | 2.156 | 0.469 | 2.625 |
| 88.00411522633746 | 1.297 | 2.25 | 0.484 | 2.719 |
| 88.1687242798354 | 1.313 | 2.36 | 0.5 | 2.828 |
| 88.33333333333333 | 1.313 | 2.469 | 0.516 | 2.922 |
| 88.49794238683127 | 1.328 | 2.563 | 0.516 | 3.016 |
| 88.66255144032922 | 1.328 | 2.688 | 0.531 | 3.125 |
| 88.83744855967079 | 1.344 | 2.797 | 0.547 | 3.235 |
| 89.00205761316872 | 1.344 | 2.953 | 0.547 | 3.375 |
| 89.16666666666667 | 1.328 | 3.094 | 0.547 | 3.5 |
| 89.33127572016461 | 1.328 | 3.266 | 0.547 | 3.672 |
| 89.49588477366255 | 1.313 | 3.469 | 0.531 | 3.844 |
| 89.67078189300413 | 1.313 | 3.641 | 0.531 | 4.016 |
| 89.83539094650206 | 1.297 | 3.844 | 0.531 | 4.188 |
| 90.0 | 1.281 | 4.047 | 0.516 | 4.391 |
| 90.16460905349794 | 1.266 | 4.25 | 0.5 | 4.563 |
| 90.32921810699588 | 1.266 | 4.453 | 0.484 | 4.735 |
| 90.50411522633745 | 1.266 | 4.657 | 0.453 | 4.938 |
| 90.66872427983539 | 1.25 | 4.891 | 0.422 | 5.157 |
| 90.83333333333334 | 1.219 | 5.172 | 0.375 | 5.407 |
| 90.99794238683127 | 1.203 | 5.438 | 0.328 | 5.657 |
| 91.16255144032922 | 1.188 | 5.688 | 0.281 | 5.891 |
| 91.33744855967079 | 1.188 | 5.938 | 0.234 | 6.141 |
| 91.50205761316873 | 1.188 | 6.188 | 0.188 | 6.375 |
| 91.66666666666666 | 1.188 | 6.438 | 0.141 | 6.61 |
| 91.8312757201646 | 1.203 | 6.688 | 0.078 | 6.86 |
| 91.99588477366255 | 1.219 | 6.922 | 0.031 | 7.079 |
| 92.17078189300412 | 1.234 | 7.11 | -0.031 | 7.266 |
| 92.33539094650206 | 1.266 | 7.313 | -0.078 | 7.469 |
| 92.5 | 1.297 | 7.516 | -0.141 | 7.672 |
| 92.66460905349794 | 1.328 | 7.704 | -0.188 | 7.86 |
| 92.8292181069959 | 1.344 | 7.875 | -0.25 | 8.047 |
| 93.00411522633746 | 1.391 | 8.016 | -0.313 | 8.204 |
| 93.1687242798354 | 1.406 | 8.141 | -0.391 | 8.329 |
| 93.33333333333333 | 1.453 | 8.219 | -0.469 | 8.422 |
| 93.49794238683128 | 1.484 | 8.266 | -0.563 | 8.485 |
| 93.66255144032921 | 1.531 | 8.251 | -0.641 | 8.485 |
| 93.83744855967079 | 1.594 | 8.204 | -0.734 | 8.454 |
| 94.00205761316872 | 1.641 | 8.11 | -0.828 | 8.407 |
| 94.16666666666667 | 1.672 | 8 | -0.922 | 8.313 |
| 94.33127572016461 | 1.656 | 7.891 | -1.031 | 8.235 |
| 94.49588477366255 | 1.688 | 7.829 | -1.141 | 8.219 |
| 94.67078189300412 | 1.75 | 7.75 | -1.25 | 8.188 |
| 94.83539094650206 | 1.813 | 7.61 | -1.359 | 8.079 |
| 95.0 | 1.922 | 7.454 | -1.469 | 7.985 |
| 95.16460905349794 | 2 | 7.204 | -1.578 | 7.797 |
| 95.32921810699588 | 2.078 | 6.938 | -1.688 | 7.579 |
| 95.50411522633745 | 2.141 | 6.641 | -1.781 | 7.36 |
| 95.66872427983539 | 2.188 | 6.297 | -1.891 | 7.094 |
| 95.83333333333334 | 2.172 | 6.11 | -2 | 6.954 |
| 95.99794238683128 | 2.156 | 5.86 | -2.094 | 6.75 |
| 96.16255144032922 | 2.141 | 5.657 | -2.172 | 6.579 |
| 96.33744855967079 | 2.125 | 5.5 | -2.25 | 6.454 |
| 96.50205761316873 | 2.11 | 5.422 | -2.313 | 6.407 |
| 96.66666666666666 | 2.078 | 5.375 | -2.328 | 6.36 |
| 96.83127572016461 | 2.031 | 5.313 | -2.344 | 6.313 |
| 96.99588477366255 | 1.984 | 5.266 | -2.344 | 6.266 |
| 97.17078189300412 | 1.969 | 5.25 | -2.344 | 6.235 |
| 97.33539094650206 | 2 | 5.266 | -2.328 | 6.25 |
| 97.5 | 2.047 | 5.297 | -2.313 | 6.297 |
| 97.66460905349795 | 2.125 | 5.266 | -2.313 | 6.297 |
| 97.8292181069959 | 2.203 | 5.313 | -2.328 | 6.36 |
| 98.00411522633746 | 2.281 | 5.438 | -2.313 | 6.469 |
| 98.1687242798354 | 2.406 | 5.5 | -2.297 | 6.563 |
| 98.33333333333333 | 2.547 | 5.594 | -2.25 | 6.672 |
| 98.49794238683128 | 2.703 | 5.688 | -2.203 | 6.797 |
| 98.66255144032921 | 2.844 | 5.766 | -2.172 | 6.907 |
| 98.83744855967078 | 3.047 | 5.86 | -2.11 | 7.047 |
| 99.00205761316873 | 3.235 | 5.938 | -2.031 | 7.172 |
| 99.16666666666667 | 3.406 | 6.032 | -1.969 | 7.329 |
| 99.33127572016461 | 3.578 | 6.11 | -1.906 | 7.469 |
| 99.49588477366255 | 3.75 | 6.204 | -1.828 | 7.625 |
| 99.67078189300412 | 3.953 | 6.313 | -1.75 | 7.813 |
| 99.83539094650207 | 4.141 | 6.422 | -1.672 | 7.985 |
| 100.0 | 4.344 | 6.5 | -1.594 | 8.157 |